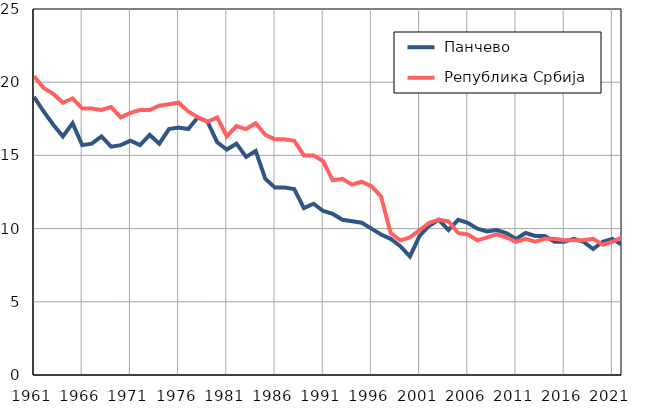
| Category |  Панчево |  Република Србија |
|---|---|---|
| 1961.0 | 19 | 20.4 |
| 1962.0 | 18 | 19.6 |
| 1963.0 | 17.1 | 19.2 |
| 1964.0 | 16.3 | 18.6 |
| 1965.0 | 17.2 | 18.9 |
| 1966.0 | 15.7 | 18.2 |
| 1967.0 | 15.8 | 18.2 |
| 1968.0 | 16.3 | 18.1 |
| 1969.0 | 15.6 | 18.3 |
| 1970.0 | 15.7 | 17.6 |
| 1971.0 | 16 | 17.9 |
| 1972.0 | 15.7 | 18.1 |
| 1973.0 | 16.4 | 18.1 |
| 1974.0 | 15.8 | 18.4 |
| 1975.0 | 16.8 | 18.5 |
| 1976.0 | 16.9 | 18.6 |
| 1977.0 | 16.8 | 18 |
| 1978.0 | 17.6 | 17.6 |
| 1979.0 | 17.3 | 17.3 |
| 1980.0 | 15.9 | 17.6 |
| 1981.0 | 15.4 | 16.3 |
| 1982.0 | 15.8 | 17 |
| 1983.0 | 14.9 | 16.8 |
| 1984.0 | 15.3 | 17.2 |
| 1985.0 | 13.4 | 16.4 |
| 1986.0 | 12.8 | 16.1 |
| 1987.0 | 12.8 | 16.1 |
| 1988.0 | 12.7 | 16 |
| 1989.0 | 11.4 | 15 |
| 1990.0 | 11.7 | 15 |
| 1991.0 | 11.2 | 14.6 |
| 1992.0 | 11 | 13.3 |
| 1993.0 | 10.6 | 13.4 |
| 1994.0 | 10.5 | 13 |
| 1995.0 | 10.4 | 13.2 |
| 1996.0 | 10 | 12.9 |
| 1997.0 | 9.6 | 12.2 |
| 1998.0 | 9.3 | 9.7 |
| 1999.0 | 8.8 | 9.2 |
| 2000.0 | 8.1 | 9.4 |
| 2001.0 | 9.5 | 9.9 |
| 2002.0 | 10.2 | 10.4 |
| 2003.0 | 10.6 | 10.6 |
| 2004.0 | 9.9 | 10.5 |
| 2005.0 | 10.6 | 9.7 |
| 2006.0 | 10.4 | 9.6 |
| 2007.0 | 10 | 9.2 |
| 2008.0 | 9.8 | 9.4 |
| 2009.0 | 9.9 | 9.6 |
| 2010.0 | 9.7 | 9.4 |
| 2011.0 | 9.3 | 9.1 |
| 2012.0 | 9.7 | 9.3 |
| 2013.0 | 9.5 | 9.1 |
| 2014.0 | 9.5 | 9.3 |
| 2015.0 | 9.1 | 9.3 |
| 2016.0 | 9.1 | 9.2 |
| 2017.0 | 9.3 | 9.2 |
| 2018.0 | 9.1 | 9.2 |
| 2019.0 | 8.6 | 9.3 |
| 2020.0 | 9.1 | 8.9 |
| 2021.0 | 9.3 | 9.1 |
| 2022.0 | 8.9 | 9.4 |